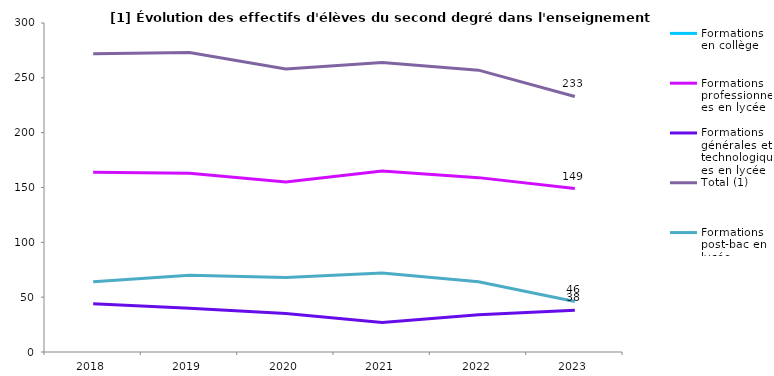
| Category | Formations en collège | Formations professionnelles en lycée | Formations générales et technologiques en lycée | Total (1) | Formations post-bac en lycée |
|---|---|---|---|---|---|
| 2018.0 |  | 164 | 44 | 272 | 64 |
| 2019.0 |  | 163 | 40 | 273 | 70 |
| 2020.0 |  | 155 | 35 | 258 | 68 |
| 2021.0 |  | 165 | 27 | 264 | 72 |
| 2022.0 |  | 159 | 34 | 257 | 64 |
| 2023.0 |  | 149 | 38 | 233 | 46 |